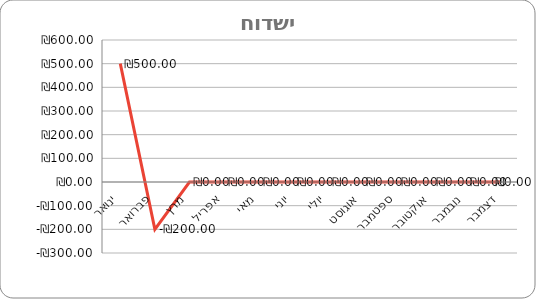
| Category | Series 0 |
|---|---|
| ינואר | 500 |
| פברואר | -200 |
| מרץ | 0 |
| אפריל | 0 |
| מאי | 0 |
| יוני | 0 |
| יולי | 0 |
| אוגוסט | 0 |
| ספטמבר | 0 |
| אוקטובר | 0 |
| נובמבר | 0 |
| דצמבר | 0 |